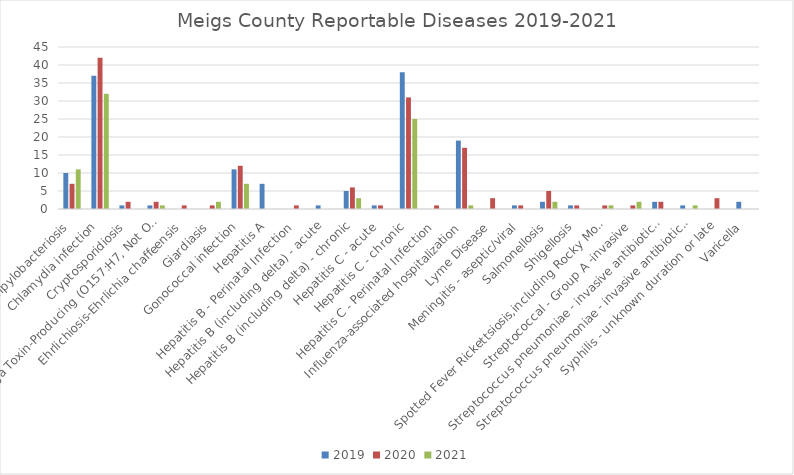
| Category | 2019 | 2020 | 2021 |
|---|---|---|---|
| Campylobacteriosis | 10 | 7 | 11 |
| Chlamydia infection | 37 | 42 | 32 |
| Cryptosporidiosis | 1 | 2 | 0 |
| E. coli, Shiga Toxin-Producing (O157:H7, Not O157, Unknown Serotype) | 1 | 2 | 1 |
| Ehrlichiosis-Ehrlichia chaffeensis | 0 | 1 | 0 |
| Giardiasis | 0 | 1 | 2 |
| Gonococcal infection | 11 | 12 | 7 |
| Hepatitis A | 7 | 0 | 0 |
| Hepatitis B - Perinatal Infection | 0 | 1 | 0 |
| Hepatitis B (including delta) - acute | 1 | 0 | 0 |
| Hepatitis B (including delta) - chronic | 5 | 6 | 3 |
| Hepatitis C - acute | 1 | 1 | 0 |
| Hepatitis C - chronic | 38 | 31 | 25 |
| Hepatitis C - Perinatal Infection | 0 | 1 | 0 |
| Influenza-associated hospitalization | 19 | 17 | 1 |
| Lyme Disease | 0 | 3 | 0 |
| Meningitis - aseptic/viral | 1 | 1 | 0 |
| Salmonellosis | 2 | 5 | 2 |
| Shigellosis | 1 | 1 | 0 |
| Spotted Fever Rickettsiosis,including Rocky Mountain spotted fever (RMSF) | 0 | 1 | 1 |
| Streptococcal - Group A -invasive | 0 | 1 | 2 |
| Streptococcus pneumoniae - invasive antibiotic resistance unknown or non-resistant | 2 | 2 | 0 |
| Streptococcus pneumoniae - invasive antibiotic resistant/intermediate | 1 | 0 | 1 |
| Syphilis - unknown duration or late | 0 | 3 | 0 |
| Varicella | 2 | 0 | 0 |